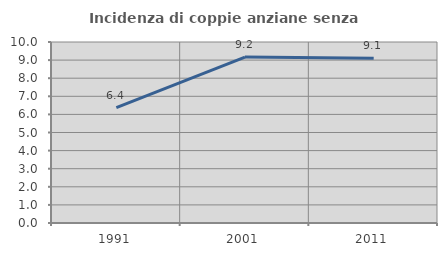
| Category | Incidenza di coppie anziane senza figli  |
|---|---|
| 1991.0 | 6.371 |
| 2001.0 | 9.168 |
| 2011.0 | 9.099 |